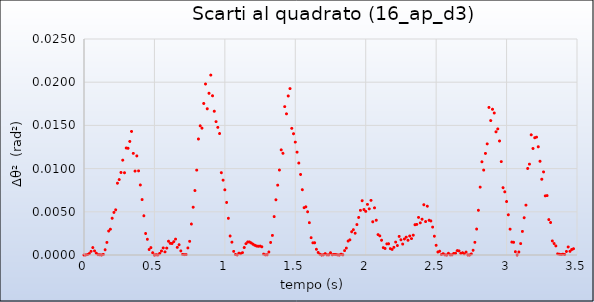
| Category | Series 0 |
|---|---|
| 0.0 | 0 |
| 0.012500000000000067 | 0 |
| 0.025000000000000022 | 0 |
| 0.03749999999999998 | 0 |
| 0.050000000000000044 | 0 |
| 0.0625 | 0.001 |
| 0.07500000000000007 | 0 |
| 0.08750000000000002 | 0 |
| 0.09999999999999998 | 0 |
| 0.11250000000000004 | 0 |
| 0.125 | 0 |
| 0.13750000000000007 | 0 |
| 0.15000000000000002 | 0.001 |
| 0.16249999999999998 | 0.001 |
| 0.17500000000000004 | 0.003 |
| 0.1875 | 0.003 |
| 0.20000000000000007 | 0.004 |
| 0.21250000000000002 | 0.005 |
| 0.22499999999999998 | 0.005 |
| 0.23750000000000004 | 0.008 |
| 0.25 | 0.009 |
| 0.26250000000000007 | 0.01 |
| 0.275 | 0.011 |
| 0.2875 | 0.01 |
| 0.30000000000000004 | 0.012 |
| 0.3125 | 0.012 |
| 0.32500000000000007 | 0.013 |
| 0.3375 | 0.014 |
| 0.35 | 0.012 |
| 0.36250000000000004 | 0.01 |
| 0.375 | 0.011 |
| 0.38750000000000007 | 0.01 |
| 0.4 | 0.008 |
| 0.4125 | 0.006 |
| 0.42499999999999993 | 0.005 |
| 0.4375000000000001 | 0.002 |
| 0.45000000000000007 | 0.002 |
| 0.4625 | 0.001 |
| 0.475 | 0.001 |
| 0.48749999999999993 | 0 |
| 0.5000000000000001 | 0 |
| 0.5125000000000001 | 0 |
| 0.525 | 0 |
| 0.5375 | 0 |
| 0.5499999999999999 | 0 |
| 0.5625000000000001 | 0.001 |
| 0.5750000000000001 | 0 |
| 0.5875 | 0.001 |
| 0.6 | 0.002 |
| 0.6124999999999999 | 0.001 |
| 0.6250000000000001 | 0.001 |
| 0.6375000000000001 | 0.002 |
| 0.65 | 0.002 |
| 0.6625 | 0.001 |
| 0.6749999999999999 | 0.001 |
| 0.6875000000000001 | 0 |
| 0.7000000000000001 | 0 |
| 0.7125 | 0 |
| 0.725 | 0 |
| 0.7374999999999999 | 0.001 |
| 0.7500000000000001 | 0.002 |
| 0.7625000000000001 | 0.004 |
| 0.775 | 0.006 |
| 0.7875 | 0.007 |
| 0.7999999999999999 | 0.01 |
| 0.8125000000000001 | 0.013 |
| 0.8250000000000001 | 0.015 |
| 0.8375 | 0.015 |
| 0.85 | 0.018 |
| 0.8624999999999999 | 0.02 |
| 0.8750000000000001 | 0.017 |
| 0.8875000000000001 | 0.019 |
| 0.9 | 0.021 |
| 0.9125 | 0.018 |
| 0.9249999999999999 | 0.017 |
| 0.9375000000000001 | 0.015 |
| 0.9500000000000001 | 0.015 |
| 0.9625 | 0.014 |
| 0.975 | 0.01 |
| 0.9874999999999999 | 0.009 |
| 1.0 | 0.008 |
| 1.0125000000000002 | 0.006 |
| 1.025 | 0.004 |
| 1.0375 | 0.002 |
| 1.0499999999999998 | 0.001 |
| 1.0625 | 0 |
| 1.0750000000000002 | 0 |
| 1.0875 | 0 |
| 1.1 | 0 |
| 1.1124999999999998 | 0 |
| 1.125 | 0 |
| 1.1375000000000002 | 0.001 |
| 1.15 | 0.001 |
| 1.1625 | 0.002 |
| 1.1749999999999998 | 0.002 |
| 1.1875 | 0.001 |
| 1.2000000000000002 | 0.001 |
| 1.2125 | 0.001 |
| 1.225 | 0.001 |
| 1.2374999999999998 | 0.001 |
| 1.25 | 0.001 |
| 1.2625000000000002 | 0.001 |
| 1.275 | 0 |
| 1.2875 | 0 |
| 1.2999999999999998 | 0 |
| 1.3125 | 0 |
| 1.3250000000000002 | 0.001 |
| 1.3375 | 0.002 |
| 1.35 | 0.004 |
| 1.3624999999999998 | 0.006 |
| 1.375 | 0.008 |
| 1.3875000000000002 | 0.01 |
| 1.4 | 0.012 |
| 1.4125 | 0.012 |
| 1.4249999999999998 | 0.017 |
| 1.4375 | 0.016 |
| 1.4499999999999997 | 0.018 |
| 1.4625 | 0.019 |
| 1.475 | 0.015 |
| 1.4874999999999998 | 0.014 |
| 1.5 | 0.013 |
| 1.5124999999999997 | 0.012 |
| 1.525 | 0.011 |
| 1.5375 | 0.009 |
| 1.5499999999999998 | 0.008 |
| 1.5625 | 0.005 |
| 1.5749999999999997 | 0.006 |
| 1.5875 | 0.005 |
| 1.6 | 0.004 |
| 1.6124999999999998 | 0.002 |
| 1.625 | 0.001 |
| 1.6374999999999997 | 0.001 |
| 1.65 | 0.001 |
| 1.6625 | 0 |
| 1.6749999999999998 | 0 |
| 1.6875 | 0 |
| 1.6999999999999997 | 0 |
| 1.7125 | 0 |
| 1.725 | 0 |
| 1.7374999999999998 | 0 |
| 1.75 | 0 |
| 1.7624999999999997 | 0 |
| 1.775 | 0 |
| 1.7875 | 0 |
| 1.7999999999999998 | 0 |
| 1.8125 | 0 |
| 1.8249999999999997 | 0 |
| 1.8375 | 0 |
| 1.85 | 0.001 |
| 1.8624999999999998 | 0.001 |
| 1.875 | 0.002 |
| 1.8874999999999997 | 0.002 |
| 1.9 | 0.003 |
| 1.9125 | 0.003 |
| 1.9249999999999998 | 0.003 |
| 1.9375 | 0.004 |
| 1.9499999999999997 | 0.004 |
| 1.9625 | 0.005 |
| 1.975 | 0.006 |
| 1.9874999999999998 | 0.005 |
| 2.0 | 0.005 |
| 2.0124999999999997 | 0.006 |
| 2.025 | 0.005 |
| 2.0375 | 0.006 |
| 2.05 | 0.004 |
| 2.0625 | 0.005 |
| 2.0749999999999997 | 0.004 |
| 2.0875 | 0.002 |
| 2.1 | 0.002 |
| 2.1125 | 0.002 |
| 2.125 | 0.001 |
| 2.1374999999999997 | 0.001 |
| 2.15 | 0.001 |
| 2.1625 | 0.001 |
| 2.175 | 0.001 |
| 2.1875 | 0.001 |
| 2.1999999999999997 | 0.001 |
| 2.2125 | 0.001 |
| 2.225 | 0.001 |
| 2.2375 | 0.002 |
| 2.25 | 0.002 |
| 2.2624999999999997 | 0.001 |
| 2.275 | 0.002 |
| 2.2875 | 0.002 |
| 2.3 | 0.002 |
| 2.3125 | 0.002 |
| 2.3249999999999997 | 0.002 |
| 2.3375 | 0.002 |
| 2.35 | 0.004 |
| 2.3625 | 0.004 |
| 2.375 | 0.004 |
| 2.3874999999999997 | 0.004 |
| 2.4 | 0.004 |
| 2.4125 | 0.006 |
| 2.425 | 0.004 |
| 2.4375 | 0.006 |
| 2.4499999999999997 | 0.004 |
| 2.4625 | 0.004 |
| 2.475 | 0.003 |
| 2.4875 | 0.002 |
| 2.5 | 0.001 |
| 2.5124999999999997 | 0 |
| 2.525 | 0 |
| 2.5375 | 0 |
| 2.55 | 0 |
| 2.5625 | 0 |
| 2.5749999999999997 | 0 |
| 2.5875 | 0 |
| 2.6 | 0 |
| 2.6125 | 0 |
| 2.625 | 0 |
| 2.6374999999999997 | 0 |
| 2.65 | 0.001 |
| 2.6625 | 0 |
| 2.675 | 0 |
| 2.6875 | 0 |
| 2.6999999999999997 | 0 |
| 2.7125 | 0 |
| 2.725 | 0 |
| 2.7375 | 0 |
| 2.75 | 0 |
| 2.7624999999999997 | 0.001 |
| 2.775 | 0.001 |
| 2.7875 | 0.003 |
| 2.8 | 0.005 |
| 2.8125 | 0.008 |
| 2.8249999999999997 | 0.011 |
| 2.8375 | 0.01 |
| 2.85 | 0.012 |
| 2.8625 | 0.013 |
| 2.875 | 0.017 |
| 2.8874999999999997 | 0.016 |
| 2.9 | 0.017 |
| 2.9125 | 0.016 |
| 2.925 | 0.014 |
| 2.9375 | 0.015 |
| 2.9499999999999997 | 0.013 |
| 2.9625 | 0.011 |
| 2.975 | 0.008 |
| 2.9875 | 0.007 |
| 3.0 | 0.006 |
| 3.0124999999999997 | 0.005 |
| 3.025 | 0.003 |
| 3.0375 | 0.001 |
| 3.05 | 0.001 |
| 3.0625 | 0 |
| 3.0749999999999997 | 0 |
| 3.0875 | 0 |
| 3.1 | 0.001 |
| 3.1125 | 0.003 |
| 3.125 | 0.004 |
| 3.1374999999999997 | 0.006 |
| 3.15 | 0.01 |
| 3.1625 | 0.011 |
| 3.175 | 0.014 |
| 3.1875 | 0.012 |
| 3.1999999999999997 | 0.014 |
| 3.2125 | 0.014 |
| 3.225 | 0.013 |
| 3.2375 | 0.011 |
| 3.25 | 0.009 |
| 3.2624999999999997 | 0.01 |
| 3.275 | 0.007 |
| 3.2875 | 0.007 |
| 3.3 | 0.004 |
| 3.3125 | 0.004 |
| 3.3249999999999997 | 0.002 |
| 3.3375 | 0.001 |
| 3.35 | 0.001 |
| 3.3625 | 0 |
| 3.375 | 0 |
| 3.3874999999999997 | 0 |
| 3.4 | 0 |
| 3.4125 | 0 |
| 3.4250000000000003 | 0 |
| 3.4374999999999996 | 0.001 |
| 3.4499999999999997 | 0 |
| 3.4625 | 0.001 |
| 3.475 | 0.001 |